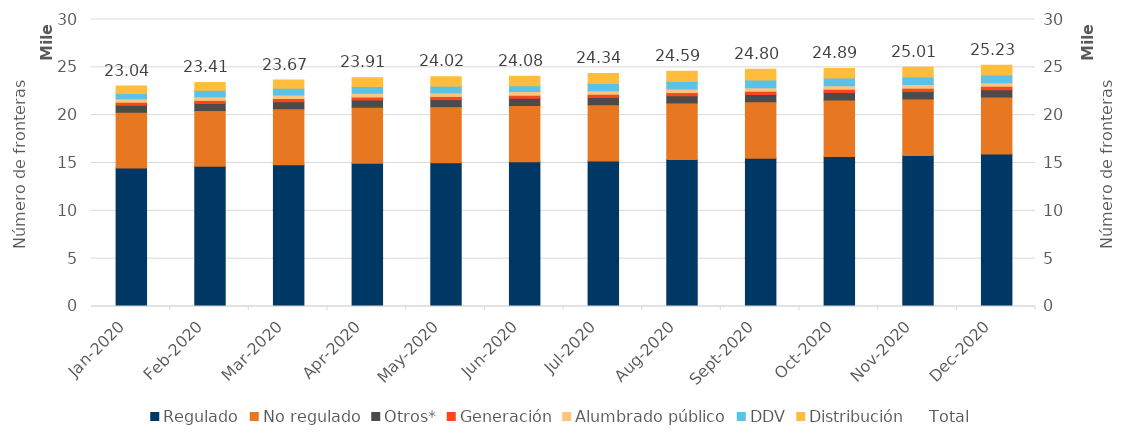
| Category | Regulado | No regulado | Otros* | Generación | Alumbrado público | DDV | Distribución |
|---|---|---|---|---|---|---|---|
| 2020-01-31 | 14466 | 5827 | 738 | 324 | 369 | 540 | 774 |
| 2020-02-29 | 14648 | 5834 | 738 | 325 | 367 | 688 | 808 |
| 2020-03-31 | 14806 | 5862 | 739 | 326 | 374 | 706 | 856 |
| 2020-04-30 | 14965 | 5870 | 741 | 327 | 376 | 728 | 900 |
| 2020-05-31 | 15018 | 5870 | 741 | 327 | 377 | 699 | 983 |
| 2020-06-30 | 15139 | 5878 | 743 | 331 | 378 | 613 | 993 |
| 2020-07-31 | 15199 | 5894 | 748 | 333 | 376 | 755 | 1039 |
| 2020-08-31 | 15372 | 5903 | 752 | 335 | 376 | 785 | 1065 |
| 2020-09-30 | 15497 | 5905 | 754 | 338 | 379 | 800 | 1125 |
| 2020-10-31 | 15685 | 5912 | 760 | 349 | 379 | 799 | 1003 |
| 2020-11-30 | 15776 | 5925 | 763 | 352 | 382 | 799 | 1013 |
| 2020-12-31 | 15944 | 5949 | 766 | 351 | 378 | 812 | 1025 |